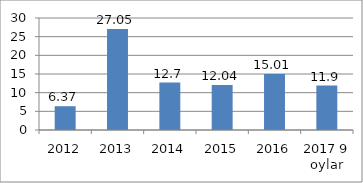
| Category | Series 0 |
|---|---|
| 2012 | 6.37 |
| 2013 | 27.05 |
| 2014 | 12.7 |
| 2015 | 12.04 |
| 2016 | 15.01 |
| 2017 9 oylar | 11.9 |